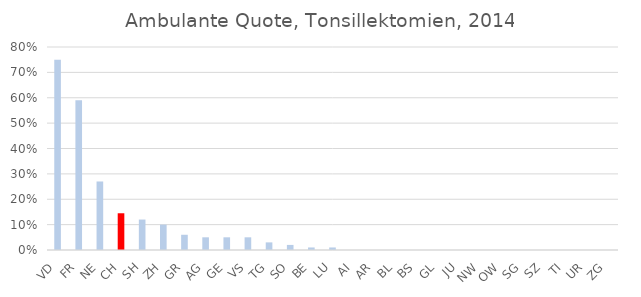
| Category | 2014 |
|---|---|
| VD | 0.75 |
| FR | 0.59 |
| NE | 0.27 |
| CH | 0.145 |
| SH | 0.12 |
| ZH | 0.1 |
| GR | 0.06 |
| AG | 0.05 |
| GE | 0.05 |
| VS | 0.05 |
| TG | 0.03 |
| SO | 0.02 |
| BE | 0.01 |
| LU | 0.01 |
| AI | 0 |
| AR | 0 |
| BL | 0 |
| BS | 0 |
| GL | 0 |
| JU | 0 |
| NW | 0 |
| OW | 0 |
| SG | 0 |
| SZ | 0 |
| TI | 0 |
| UR | 0 |
| ZG | 0 |